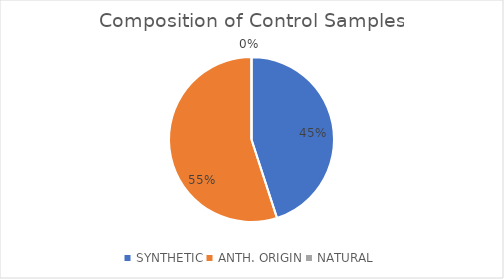
| Category | CONTROL |
|---|---|
| SYNTHETIC | 0.45 |
| ANTH. ORIGIN | 0.55 |
| NATURAL | 0 |